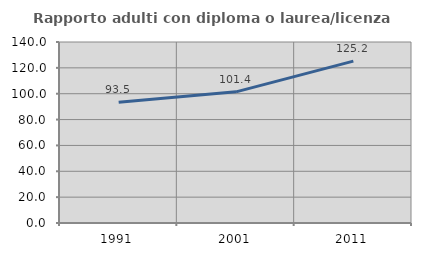
| Category | Rapporto adulti con diploma o laurea/licenza media  |
|---|---|
| 1991.0 | 93.49 |
| 2001.0 | 101.447 |
| 2011.0 | 125.174 |